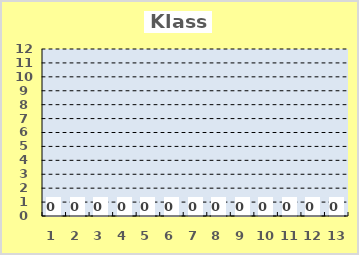
| Category | Series 0 |
|---|---|
| 1.0 | 0 |
| 2.0 | 0 |
| 3.0 | 0 |
| 4.0 | 0 |
| 5.0 | 0 |
| 6.0 | 0 |
| 7.0 | 0 |
| 8.0 | 0 |
| 9.0 | 0 |
| 10.0 | 0 |
| 11.0 | 0 |
| 12.0 | 0 |
| 13.0 | 0 |